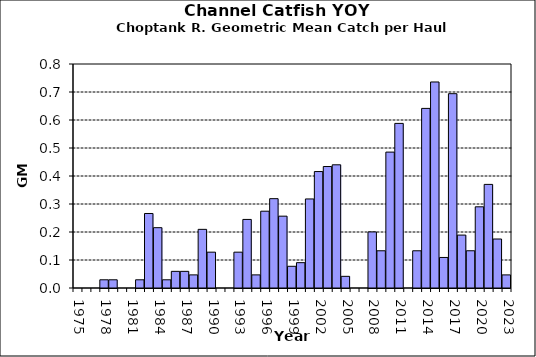
| Category | Series 0 |
|---|---|
| 1975.0 | 0 |
| 1976.0 | 0 |
| 1977.0 | 0 |
| 1978.0 | 0.029 |
| 1979.0 | 0.029 |
| 1980.0 | 0 |
| 1981.0 | 0 |
| 1982.0 | 0.029 |
| 1983.0 | 0.266 |
| 1984.0 | 0.215 |
| 1985.0 | 0.029 |
| 1986.0 | 0.059 |
| 1987.0 | 0.059 |
| 1988.0 | 0.047 |
| 1989.0 | 0.209 |
| 1990.0 | 0.128 |
| 1991.0 | 0 |
| 1992.0 | 0 |
| 1993.0 | 0.128 |
| 1994.0 | 0.245 |
| 1995.0 | 0.047 |
| 1996.0 | 0.274 |
| 1997.0 | 0.319 |
| 1998.0 | 0.257 |
| 1999.0 | 0.078 |
| 2000.0 | 0.091 |
| 2001.0 | 0.318 |
| 2002.0 | 0.416 |
| 2003.0 | 0.434 |
| 2004.0 | 0.44 |
| 2005.0 | 0.042 |
| 2006.0 | 0 |
| 2007.0 | 0 |
| 2008.0 | 0.2 |
| 2009.0 | 0.133 |
| 2010.0 | 0.485 |
| 2011.0 | 0.588 |
| 2012.0 | 0 |
| 2013.0 | 0.133 |
| 2014.0 | 0.641 |
| 2015.0 | 0.736 |
| 2016.0 | 0.109 |
| 2017.0 | 0.694 |
| 2018.0 | 0.189 |
| 2019.0 | 0.133 |
| 2020.0 | 0.29 |
| 2021.0 | 0.37 |
| 2022.0 | 0.175 |
| 2023.0 | 0.047 |